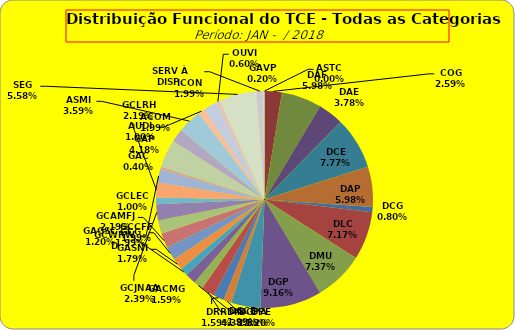
| Category | ASTC |
|---|---|
| ASTC | 0 |
| COG | 13 |
| DAF | 30 |
| DAE | 19 |
| DCE | 39 |
| DAP | 30 |
| DCG | 4 |
| DLC | 36 |
| DMU | 37 |
| DGP | 46 |
| DIN | 22 |
| DPE | 6 |
| DRR | 8 |
| DGCE | 10 |
| DGPA | 7 |
| GACMG | 8 |
| GAGSC | 6 |
| GASNI | 9 |
| GCG | 10 |
| GCAMFJ | 11 |
| GCCFF | 10 |
| GCJNAA | 12 |
| GCLEC | 5 |
| GCLRH | 11 |
| GCWRWD | 10 |
| GAC | 2 |
| GAP | 21 |
| ACOM | 10 |
| ASMI | 18 |
| AUDI | 5 |
| ICON | 10 |
| OUVI | 3 |
| SEG | 28 |
| SERV À DISP. | 5 |
| GAVP | 1 |